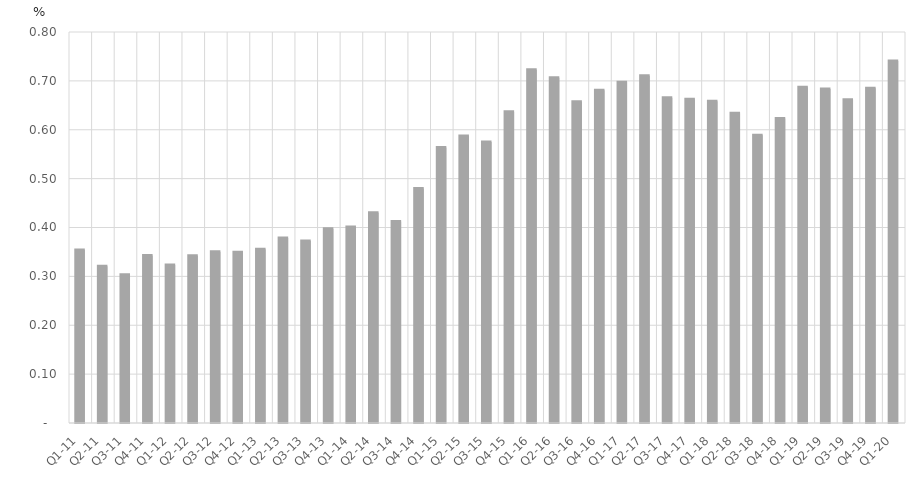
| Category | Percent of Total GDP |
|---|---|
| Q1-11 | 0.354 |
| Q2-11 | 0.321 |
| Q3-11 | 0.303 |
| Q4-11 | 0.343 |
| Q1-12 | 0.323 |
| Q2-12 | 0.342 |
| Q3-12 | 0.35 |
| Q4-12 | 0.349 |
| Q1-13 | 0.356 |
| Q2-13 | 0.378 |
| Q3-13 | 0.372 |
| Q4-13 | 0.398 |
| Q1-14 | 0.401 |
| Q2-14 | 0.43 |
| Q3-14 | 0.412 |
| Q4-14 | 0.48 |
| Q1-15 | 0.564 |
| Q2-15 | 0.587 |
| Q3-15 | 0.575 |
| Q4-15 | 0.637 |
| Q1-16 | 0.723 |
| Q2-16 | 0.707 |
| Q3-16 | 0.657 |
| Q4-16 | 0.681 |
| Q1-17 | 0.697 |
| Q2-17 | 0.71 |
| Q3-17 | 0.665 |
| Q4-17 | 0.662 |
| Q1-18 | 0.658 |
| Q2-18 | 0.634 |
| Q3-18 | 0.589 |
| Q4-18 | 0.623 |
| Q1-19 | 0.687 |
| Q2-19 | 0.683 |
| Q3-19 | 0.662 |
| Q4-19 | 0.685 |
| Q1-20 | 0.741 |